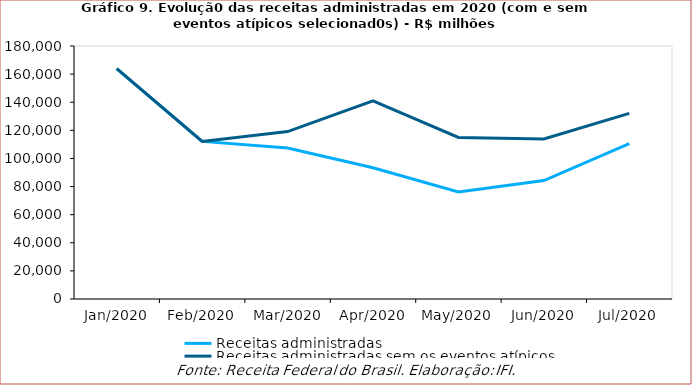
| Category | Receitas administradas | Receitas administradas sem os eventos atípicos |
|---|---|---|
| 2020-01-01 | 163948 | 163948 |
| 2020-02-01 | 112141 | 112141 |
| 2020-03-01 | 107390 | 119114 |
| 2020-04-01 | 93332 | 140911 |
| 2020-05-01 | 76139 | 114931 |
| 2020-06-01 | 84267 | 113848 |
| 2020-07-01 | 110540 | 132108 |